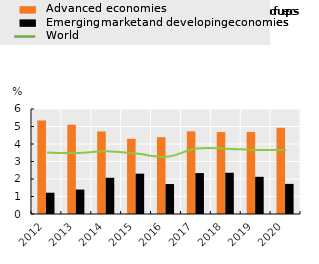
| Category | Advanced economies | Emerging market and developing economies |
|---|---|---|
| 0 | 5.347 | 1.216 |
| 1 | 5.103 | 1.398 |
| 2 | 4.716 | 2.07 |
| 3 | 4.297 | 2.305 |
| 4 | 4.389 | 1.712 |
| 5 | 4.723 | 2.339 |
| 6 | 4.682 | 2.357 |
| 7 | 4.683 | 2.125 |
| 8 | 4.929 | 1.72 |